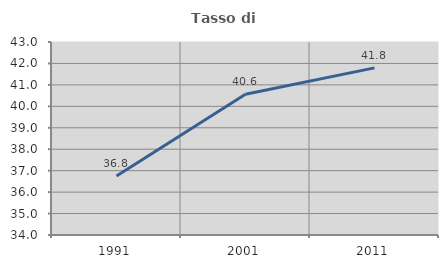
| Category | Tasso di occupazione   |
|---|---|
| 1991.0 | 36.754 |
| 2001.0 | 40.564 |
| 2011.0 | 41.795 |